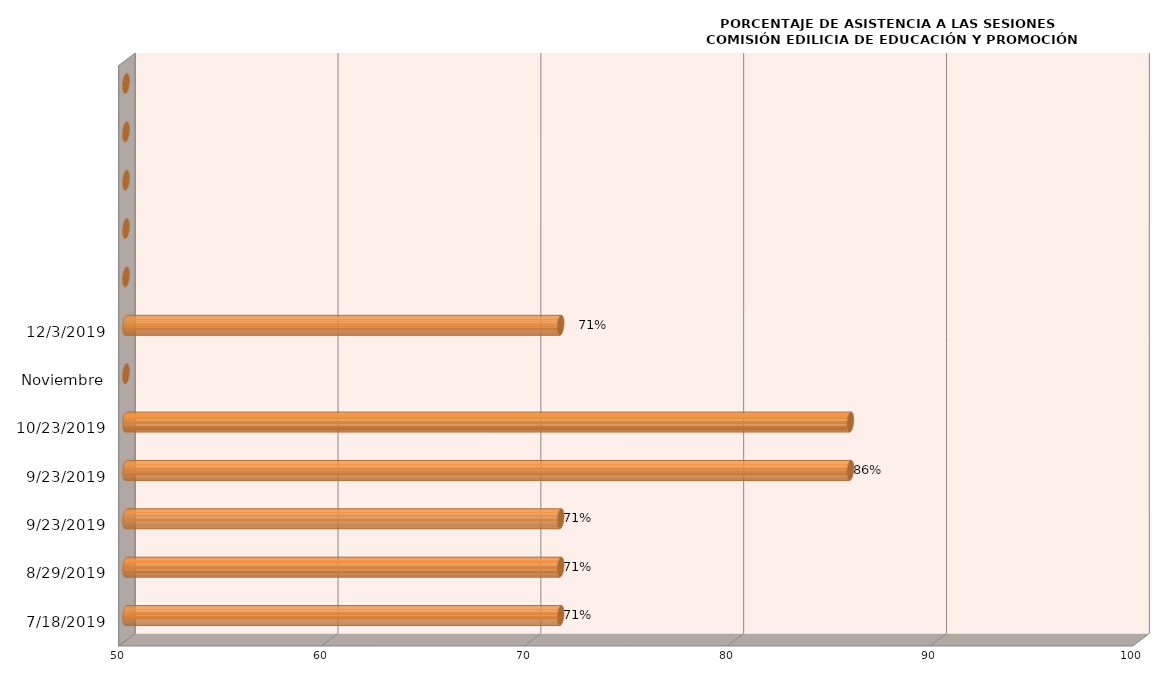
| Category | Series 0 |
|---|---|
| 18/07/2019 | 71.429 |
| 29/08/2019 | 71.429 |
| 23/09/2019 | 71.429 |
| 23/09/2019 | 85.714 |
| 23/10/2019 | 85.714 |
| Noviembre | 0 |
| 03/12/2019 | 71.429 |